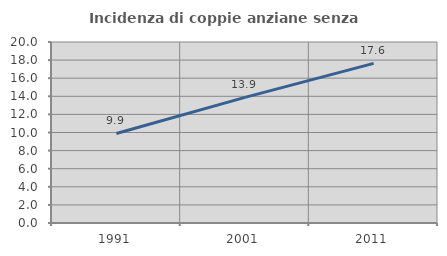
| Category | Incidenza di coppie anziane senza figli  |
|---|---|
| 1991.0 | 9.896 |
| 2001.0 | 13.881 |
| 2011.0 | 17.634 |